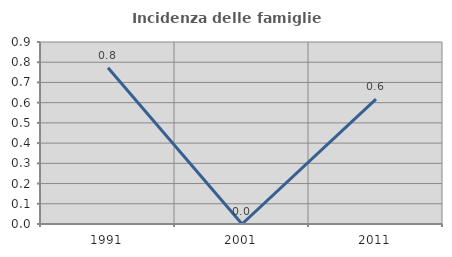
| Category | Incidenza delle famiglie numerose |
|---|---|
| 1991.0 | 0.772 |
| 2001.0 | 0 |
| 2011.0 | 0.617 |